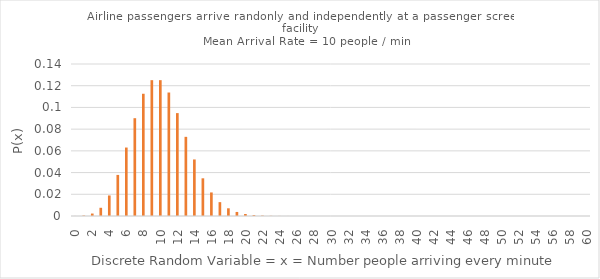
| Category | P(x) |
|---|---|
| 0.0 | 0 |
| 1.0 | 0 |
| 2.0 | 0.002 |
| 3.0 | 0.008 |
| 4.0 | 0.019 |
| 5.0 | 0.038 |
| 6.0 | 0.063 |
| 7.0 | 0.09 |
| 8.0 | 0.113 |
| 9.0 | 0.125 |
| 10.0 | 0.125 |
| 11.0 | 0.114 |
| 12.0 | 0.095 |
| 13.0 | 0.073 |
| 14.0 | 0.052 |
| 15.0 | 0.035 |
| 16.0 | 0.022 |
| 17.0 | 0.013 |
| 18.0 | 0.007 |
| 19.0 | 0.004 |
| 20.0 | 0.002 |
| 21.0 | 0.001 |
| 22.0 | 0 |
| 23.0 | 0 |
| 24.0 | 0 |
| 25.0 | 0 |
| 26.0 | 0 |
| 27.0 | 0 |
| 28.0 | 0 |
| 29.0 | 0 |
| 30.0 | 0 |
| 31.0 | 0 |
| 32.0 | 0 |
| 33.0 | 0 |
| 34.0 | 0 |
| 35.0 | 0 |
| 36.0 | 0 |
| 37.0 | 0 |
| 38.0 | 0 |
| 39.0 | 0 |
| 40.0 | 0 |
| 41.0 | 0 |
| 42.0 | 0 |
| 43.0 | 0 |
| 44.0 | 0 |
| 45.0 | 0 |
| 46.0 | 0 |
| 47.0 | 0 |
| 48.0 | 0 |
| 49.0 | 0 |
| 50.0 | 0 |
| 51.0 | 0 |
| 52.0 | 0 |
| 53.0 | 0 |
| 54.0 | 0 |
| 55.0 | 0 |
| 56.0 | 0 |
| 57.0 | 0 |
| 58.0 | 0 |
| 59.0 | 0 |
| 60.0 | 0 |